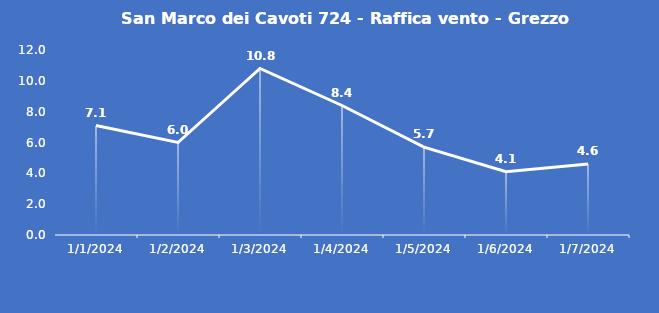
| Category | San Marco dei Cavoti 724 - Raffica vento - Grezzo (m/s) |
|---|---|
| 1/1/24 | 7.1 |
| 1/2/24 | 6 |
| 1/3/24 | 10.8 |
| 1/4/24 | 8.4 |
| 1/5/24 | 5.7 |
| 1/6/24 | 4.1 |
| 1/7/24 | 4.6 |